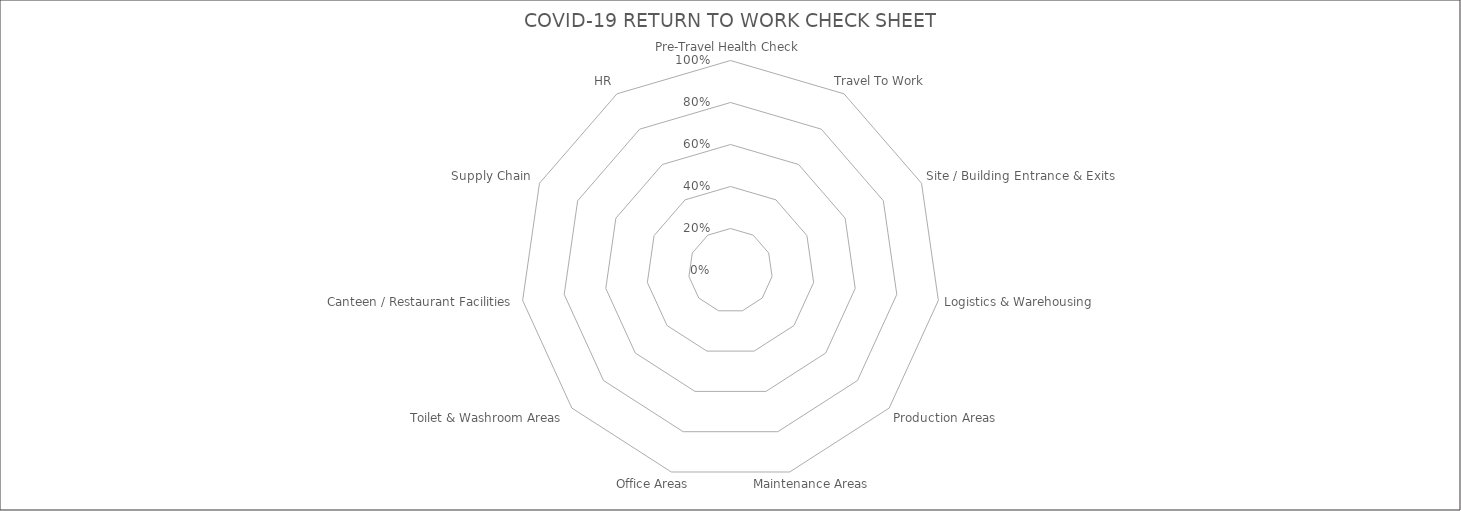
| Category | Series 0 |
|---|---|
| Pre-Travel Health Check | 0 |
| Travel To Work | 0 |
| Site / Building Entrance & Exits | 0 |
| Logistics & Warehousing | 0 |
| Production Areas | 0 |
| Maintenance Areas | 0 |
| Office Areas | 0 |
| Toilet & Washroom Areas | 0 |
| Canteen / Restaurant Facilities | 0 |
| Supply Chain | 0 |
| HR | 0 |